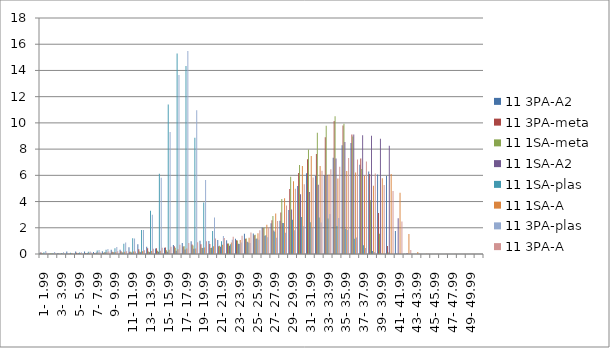
| Category | 11 3PA-A2 | 11 3PA-meta | 11 1SA-meta | 11 1SA-A2 | 11 1SA-plas | 11 1SA-A | 11 3PA-plas | 11 3PA-A |
|---|---|---|---|---|---|---|---|---|
|  1- 1.99 | 0.12 | 0.115 | 0.05 | 0.045 | 0.13 | 0.025 | 0.22 | 0.095 |
|  2- 2.99 | 0.035 | 0.005 | 0.085 | 0.025 | 0.065 | 0.035 | 0.155 | 0.035 |
|  3- 3.99 | 0.085 | 0.01 | 0.015 | 0.02 | 0.085 | 0.035 | 0.125 | 0.02 |
|  4- 4.99 | 0.19 | 0.025 | 0.02 | 0.025 | 0.1 | 0.05 | 0.08 | 0.01 |
|  5- 5.99 | 0.19 | 0.1 | 0.03 | 0.055 | 0.115 | 0.07 | 0.135 | 0.04 |
|  6- 6.99 | 0.185 | 0.065 | 0.04 | 0.085 | 0.18 | 0.095 | 0.185 | 0.11 |
|  7- 7.99 | 0.155 | 0.06 | 0.045 | 0.11 | 0.275 | 0.12 | 0.305 | 0.14 |
|  8- 8.99 | 0.205 | 0.07 | 0.125 | 0.125 | 0.32 | 0.13 | 0.38 | 0.19 |
|  9- 9.99 | 0.315 | 0.17 | 0.125 | 0.135 | 0.445 | 0.155 | 0.535 | 0.205 |
|  10- 10.99 | 0.33 | 0.21 | 0.14 | 0.12 | 0.775 | 0.18 | 0.885 | 0.205 |
|  11- 11.99 | 0.515 | 0.175 | 0.17 | 0.115 | 1.205 | 0.195 | 1.185 | 0.195 |
|  12- 12.99 | 0.745 | 0.37 | 0.185 | 0.13 | 1.835 | 0.21 | 1.835 | 0.28 |
|  13- 13.99 | 0.555 | 0.445 | 0.195 | 0.14 | 3.29 | 0.23 | 2.985 | 0.405 |
|  14- 14.99 | 0.42 | 0.435 | 0.25 | 0.165 | 6.13 | 0.25 | 5.815 | 0.47 |
|  15- 15.99 | 0.485 | 0.495 | 0.29 | 0.17 | 11.395 | 0.315 | 9.305 | 0.555 |
|  16- 16.99 | 0.685 | 0.59 | 0.475 | 0.24 | 15.295 | 0.37 | 13.655 | 0.7 |
|  17- 17.99 | 0.845 | 0.57 | 0.59 | 0.335 | 14.34 | 0.41 | 15.485 | 0.84 |
|  18- 18.99 | 0.98 | 0.725 | 0.64 | 0.4 | 8.865 | 0.41 | 10.97 | 0.895 |
|  19- 19.99 | 1.02 | 0.745 | 0.47 | 0.465 | 3.925 | 0.49 | 5.65 | 0.97 |
|  20- 20.99 | 1 | 0.76 | 0.455 | 0.485 | 1.755 | 0.6 | 2.79 | 1.175 |
|  21- 21.99 | 1.065 | 0.6 | 0.635 | 0.55 | 0.965 | 0.71 | 1.365 | 1.22 |
|  22- 22.99 | 1.055 | 0.795 | 0.805 | 0.63 | 0.735 | 0.885 | 1.095 | 1.315 |
|  23- 23.99 | 1.165 | 1.04 | 1.03 | 0.775 | 0.755 | 1.07 | 0.885 | 1.385 |
|  24- 24.99 | 1.54 | 1.16 | 1.19 | 0.935 | 0.875 | 1.245 | 0.84 | 1.645 |
|  25- 25.99 | 1.57 | 1.435 | 1.475 | 1.17 | 1.175 | 1.575 | 1.095 | 1.805 |
|  26- 26.99 | 2.02 | 1.985 | 2.025 | 1.4 | 1.435 | 2.23 | 1.285 | 2.02 |
|  27- 27.99 | 2.34 | 2.575 | 2.9 | 1.8 | 1.7 | 3.09 | 1.235 | 2.51 |
|  28- 28.99 | 2.54 | 3.165 | 4.195 | 2.365 | 2.365 | 4.255 | 1.63 | 3.705 |
|  29- 29.99 | 3.355 | 4.955 | 5.9 | 3.395 | 2.61 | 5.555 | 1.82 | 4.98 |
|  30- 30.99 | 5.18 | 6.185 | 6.79 | 4.56 | 2.82 | 6.715 | 2.12 | 5.325 |
|  31- 31.99 | 6.16 | 7.22 | 7.97 | 4.735 | 2.425 | 7.48 | 1.99 | 5.835 |
|  32- 32.99 | 5.94 | 7.63 | 9.24 | 5.285 | 2.79 | 6.705 | 2.41 | 6.345 |
|  33- 33.99 | 6.015 | 8.9 | 9.79 | 6.05 | 2.705 | 6.055 | 3.055 | 6.465 |
|  34- 34.99 | 7.34 | 10.145 | 10.505 | 7.29 | 2.14 | 5.76 | 2.745 | 6.66 |
|  35- 35.99 | 8.3 | 9.81 | 9.935 | 8.54 | 1.905 | 6.33 | 1.825 | 7.325 |
|  36- 36.99 | 8.47 | 9.105 | 8.965 | 9.12 | 1.165 | 6.215 | 1.265 | 7.2 |
|  37- 37.99 | 6.815 | 7.28 | 6.49 | 9.065 | 0.67 | 5.96 | 0.465 | 7.06 |
|  38- 38.99 | 6.3 | 6.095 | 4.105 | 9.01 | 0.235 | 5.215 | 0.16 | 6.135 |
|  39- 39.99 | 6.065 | 3.135 | 1.54 | 8.785 | 0.025 | 5.775 | 0.015 | 5.255 |
|  40- 40.99 | 5.95 | 0.615 | 0.12 | 8.265 | 0 | 6.095 | 0 | 4.8 |
|  41- 41.99 | 1.755 | 0.01 | 0.005 | 2.72 | 0 | 4.665 | 0 | 2.475 |
|  42- 42.99 | 0.02 | 0 | 0 | 0.075 | 0 | 1.53 | 0 | 0.31 |
|  43- 43.99 | 0 | 0 | 0 | 0 | 0 | 0.145 | 0 | 0.02 |
|  44- 44.99 | 0 | 0 | 0 | 0 | 0 | 0.015 | 0 | 0.015 |
|  45- 45.99 | 0 | 0 | 0 | 0 | 0 | 0.005 | 0 | 0.015 |
|  46- 46.99 | 0 | 0 | 0 | 0 | 0 | 0 | 0 | 0.015 |
|  47- 47.99 | 0 | 0 | 0 | 0 | 0 | 0 | 0 | 0.01 |
|  48- 48.99 | 0 | 0 | 0 | 0 | 0 | 0 | 0 | 0.01 |
|  49- 49.99 | 0 | 0 | 0 | 0 | 0 | 0 | 0 | 0.01 |
|  50- 50.99 | 0 | 0 | 0 | 0 | 0 | 0 | 0 | 0.005 |